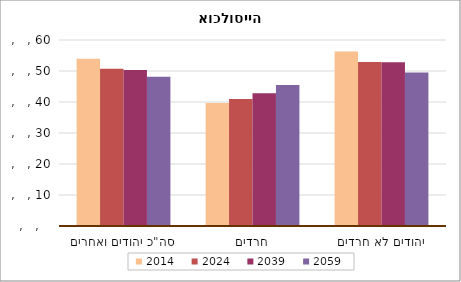
| Category | 2014 | 2024 | 2039 | 2059 |
|---|---|---|---|---|
| סה"כ יהודים ואחרים | 53.957 | 50.745 | 50.344 | 48.132 |
| חרדים | 39.681 | 40.988 | 42.86 | 45.466 |
| יהודים לא חרדים | 56.295 | 52.868 | 52.804 | 49.541 |